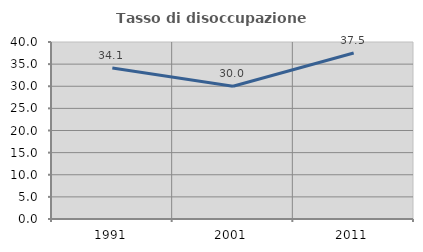
| Category | Tasso di disoccupazione giovanile  |
|---|---|
| 1991.0 | 34.146 |
| 2001.0 | 30 |
| 2011.0 | 37.5 |